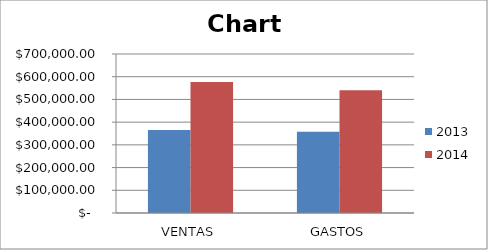
| Category | 2013 | 2014 |
|---|---|---|
| VENTAS | 365087 | 576200.24 |
| GASTOS | 357506 | 540100 |